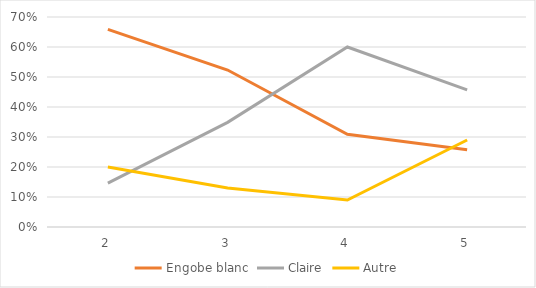
| Category | Engobe blanc | Claire | Autre |
|---|---|---|---|
| 2.0 | 0.659 | 0.146 | 0.2 |
| 3.0 | 0.523 | 0.349 | 0.13 |
| 4.0 | 0.309 | 0.6 | 0.09 |
| 5.0 | 0.257 | 0.457 | 0.29 |